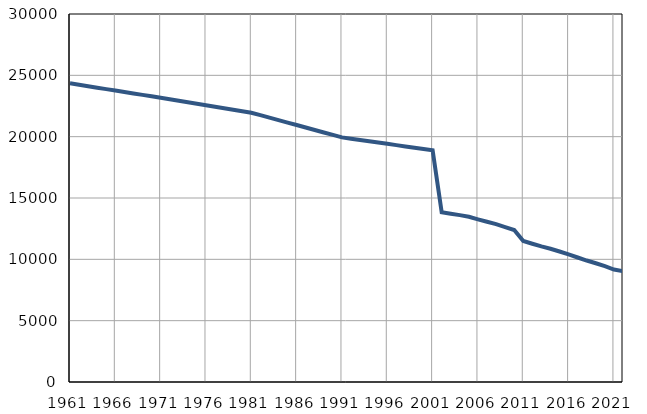
| Category | Број
становника |
|---|---|
| 1961.0 | 24347 |
| 1962.0 | 24229 |
| 1963.0 | 24111 |
| 1964.0 | 23994 |
| 1965.0 | 23876 |
| 1966.0 | 23758 |
| 1967.0 | 23640 |
| 1968.0 | 23522 |
| 1969.0 | 23405 |
| 1970.0 | 23287 |
| 1971.0 | 23169 |
| 1972.0 | 23047 |
| 1973.0 | 22925 |
| 1974.0 | 22804 |
| 1975.0 | 22683 |
| 1976.0 | 22561 |
| 1977.0 | 22439 |
| 1978.0 | 22318 |
| 1979.0 | 22196 |
| 1980.0 | 22075 |
| 1981.0 | 21953 |
| 1982.0 | 21752 |
| 1983.0 | 21551 |
| 1984.0 | 21349 |
| 1985.0 | 21148 |
| 1986.0 | 20947 |
| 1987.0 | 20745 |
| 1988.0 | 20544 |
| 1989.0 | 20343 |
| 1990.0 | 20141 |
| 1991.0 | 19940 |
| 1992.0 | 19835 |
| 1993.0 | 19730 |
| 1994.0 | 19624 |
| 1995.0 | 19519 |
| 1996.0 | 19414 |
| 1997.0 | 19309 |
| 1998.0 | 19204 |
| 1999.0 | 19099 |
| 2000.0 | 18993 |
| 2001.0 | 18888 |
| 2002.0 | 13837 |
| 2003.0 | 13716 |
| 2004.0 | 13606 |
| 2005.0 | 13467 |
| 2006.0 | 13257 |
| 2007.0 | 13064 |
| 2008.0 | 12869 |
| 2009.0 | 12629 |
| 2010.0 | 12392 |
| 2011.0 | 11494 |
| 2012.0 | 11269 |
| 2013.0 | 11054 |
| 2014.0 | 10860 |
| 2015.0 | 10640 |
| 2016.0 | 10402 |
| 2017.0 | 10150 |
| 2018.0 | 9903 |
| 2019.0 | 9682 |
| 2020.0 | 9439 |
| 2021.0 | 9168 |
| 2022.0 | 9034 |